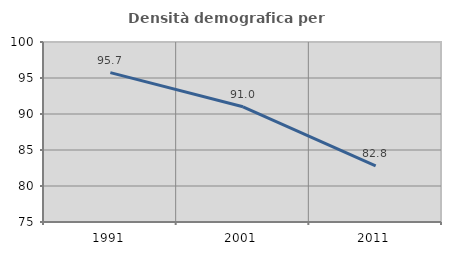
| Category | Densità demografica |
|---|---|
| 1991.0 | 95.747 |
| 2001.0 | 91.005 |
| 2011.0 | 82.783 |